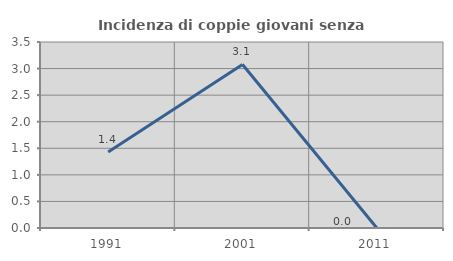
| Category | Incidenza di coppie giovani senza figli |
|---|---|
| 1991.0 | 1.429 |
| 2001.0 | 3.077 |
| 2011.0 | 0 |